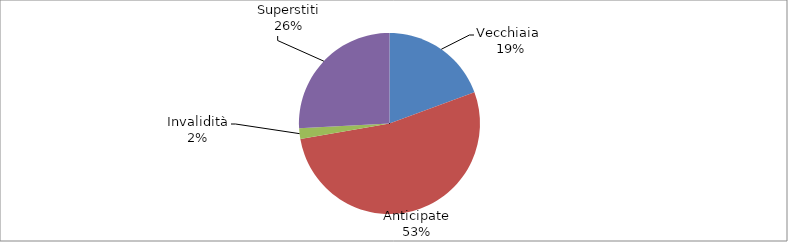
| Category | Series 0 |
|---|---|
| Vecchiaia  | 22773 |
| Anticipate | 62085 |
| Invalidità | 2254 |
| Superstiti | 30336 |